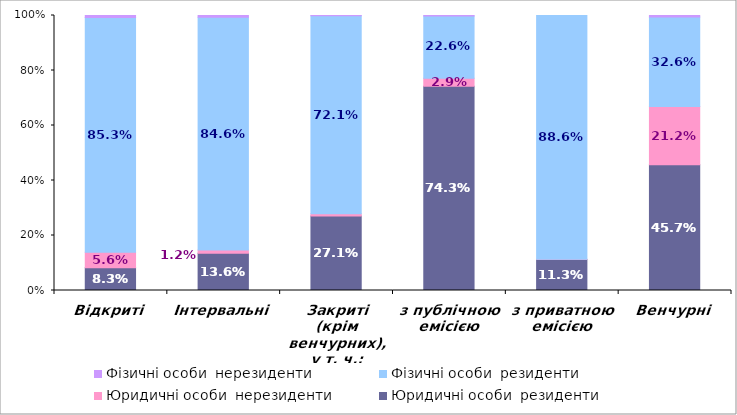
| Category | Юридичні особи  | Фізичні особи  |
|---|---|---|
| Відкриті | 0.056 | 0.007 |
| Інтервальні | 0.012 | 0.007 |
| Закриті (крім венчурних), у т. ч.: | 0.008 | 0.001 |
| з публічною емісією | 0.029 | 0.002 |
| з приватною емісією | 0.001 | 0 |
| Венчурні | 0.212 | 0.005 |